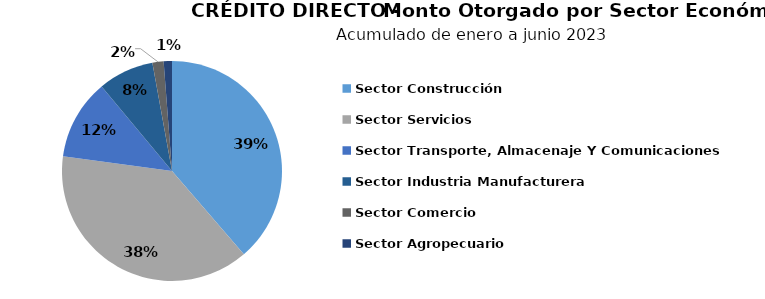
| Category | Monto |
|---|---|
| Sector Construcción | 9.824 |
| Sector Servicios | 9.772 |
| Sector Transporte, Almacenaje Y Comunicaciones | 2.999 |
| Sector Industria Manufacturera | 2.08 |
| Sector Comercio | 0.417 |
| Sector Agropecuario | 0.309 |